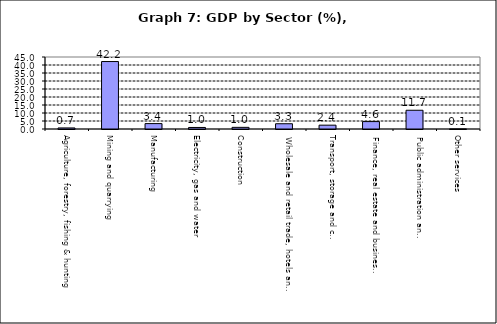
| Category | Series 0 |
|---|---|
| Agriculture, forestry, fishing & hunting | 0.662 |
| Mining and quarrying  | 42.165 |
| Manufacturing | 3.371 |
| Electricity, gas and water | 0.966 |
| Construction | 1.031 |
| Wholesale and retail trade, hotels and restaurants  | 3.283 |
| Transport, storage and communication                | 2.393 |
| Finance, real estate and business services          | 4.637 |
| Public administration and Defense                       | 11.718 |
| Other services                                    | 0.066 |